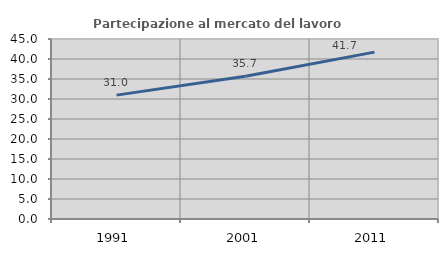
| Category | Partecipazione al mercato del lavoro  femminile |
|---|---|
| 1991.0 | 30.965 |
| 2001.0 | 35.679 |
| 2011.0 | 41.715 |